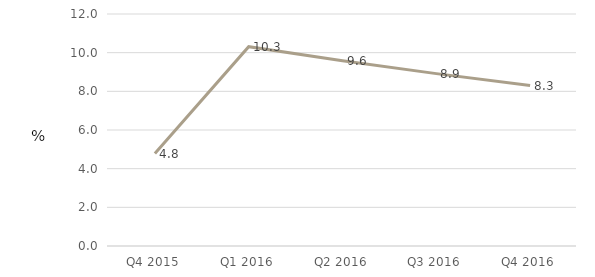
| Category | Activities of households as employers |
|---|---|
| Q4 2015 | 4.784 |
| Q1 2016 | 10.307 |
| Q2 2016 | 9.583 |
| Q3 2016 | 8.916 |
| Q4 2016 | 8.299 |